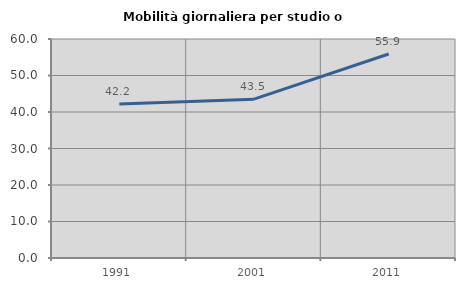
| Category | Mobilità giornaliera per studio o lavoro |
|---|---|
| 1991.0 | 42.222 |
| 2001.0 | 43.511 |
| 2011.0 | 55.882 |